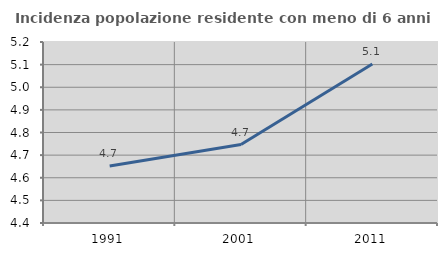
| Category | Incidenza popolazione residente con meno di 6 anni |
|---|---|
| 1991.0 | 4.652 |
| 2001.0 | 4.747 |
| 2011.0 | 5.102 |